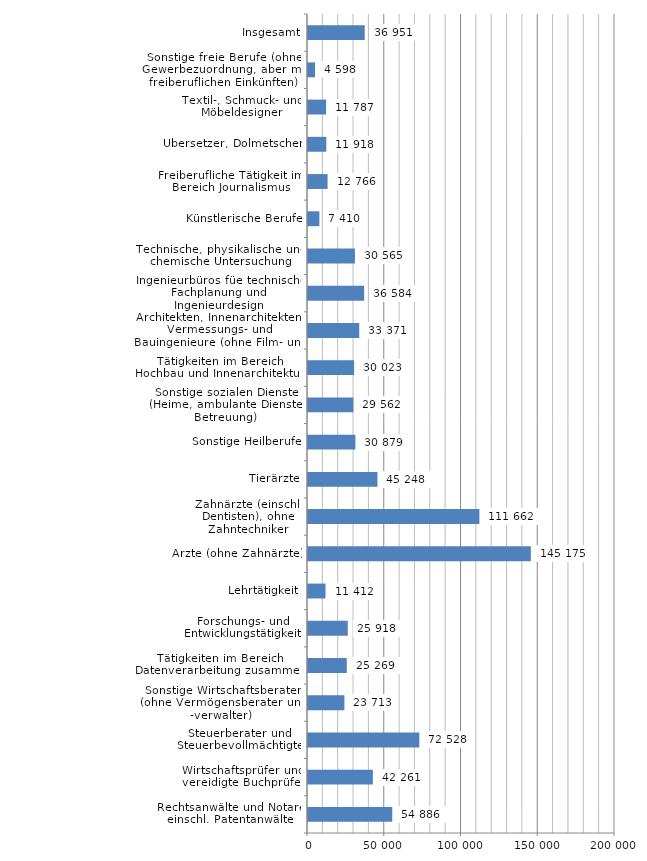
| Category | Series 0 |
|---|---|
| Rechtsanwälte und Notare einschl. Patentanwälte | 54886.128 |
| Wirtschaftsprüfer und vereidigte Buchprüfer | 42260.87 |
| Steuerberater und Steuerbevollmächtigte | 72528.239 |
| Sonstige Wirtschaftsberater (ohne Vermögensberater und -verwalter) | 23713.376 |
| Tätigkeiten im Bereich Datenverarbeitung zusammen | 25268.775 |
| Forschungs- und Entwicklungstätigkeit | 25918.033 |
| Lehrtätigkeit | 11411.888 |
| Ärzte (ohne Zahnärzte) | 145174.876 |
| Zahnärzte (einschl. Dentisten), ohne Zahntechniker | 111662.471 |
| Tierärzte | 45247.706 |
| Sonstige Heilberufe | 30879.128 |
| Sonstige sozialen Dienste (Heime, ambulante Dienste, Betreuung) | 29562.201 |
| Tätigkeiten im Bereich Hochbau und Innenarchitektur | 30023.49 |
| Architekten, Innenarchitekten, Vermessungs- und Bauingenieure (ohne Film- und Bühnenarchitekten) | 33371.286 |
| Ingenieurbüros füe technische Fachplanung und Ingenieurdesign | 36584.071 |
| Technische, physikalische und chemische Untersuchung | 30565.217 |
| Künstlerische Berufe | 7410.103 |
| Freiberufliche Tätigkeit im Bereich Journalismus | 12765.648 |
| Übersetzer, Dolmetscher | 11917.563 |
| Textil-, Schmuck- und Möbeldesigner | 11787.44 |
| Sonstige freie Berufe (ohne Gewerbezuordnung, aber mit freiberuflichen Einkünften) | 4598.297 |
| Insgesamt | 36951.452 |